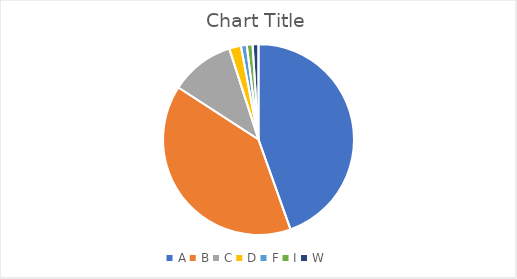
| Category | Series 0 |
|---|---|
| A | 45 |
| B | 40 |
| C | 11 |
| D | 2 |
| F | 1 |
| I | 1 |
| W | 1 |